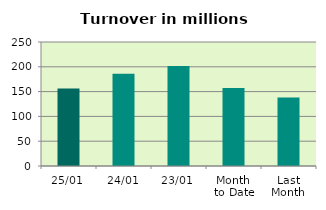
| Category | Series 0 |
|---|---|
| 25/01 | 156.108 |
| 24/01 | 185.953 |
| 23/01 | 201.841 |
| Month 
to Date | 157.506 |
| Last
Month | 138.201 |